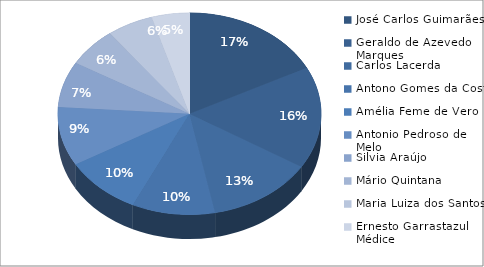
| Category | Valor |
|---|---|
| José Carlos Guimarães | 82000 |
| Geraldo de Azevedo Marques | 76800 |
| Carlos Lacerda | 61200 |
| Antono Gomes da Costa | 47900 |
| Amélia Feme de Vero | 44700 |
| Antonio Pedroso de Melo | 44300 |
| Silvia Araújo | 34500 |
| Mário Quintana | 29300 |
| Maria Luiza dos Santos | 26700 |
| Ernesto Garrastazul Médice | 21830 |